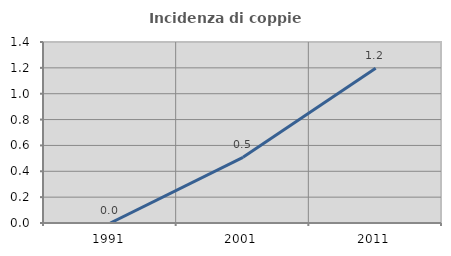
| Category | Incidenza di coppie miste |
|---|---|
| 1991.0 | 0 |
| 2001.0 | 0.508 |
| 2011.0 | 1.198 |